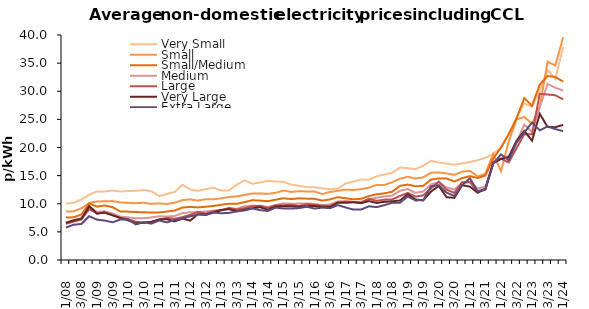
| Category | Very Small | Small | Small/Medium | Medium | Large | Very Large | Extra Large |
|---|---|---|---|---|---|---|---|
| Q1/08  | 10.021 | 8.605 | 7.549 | 6.615 | 6.438 | 6.609 | 5.766 |
| Q2/08  | 10.173 | 8.651 | 7.588 | 7.026 | 6.809 | 7.068 | 6.275 |
| Q3/08  | 10.758 | 9.199 | 8.096 | 7.475 | 7.214 | 7.329 | 6.405 |
| Q4/08  | 11.603 | 10.126 | 10.065 | 9.495 | 9.032 | 9.582 | 7.785 |
| Q1/09  | 12.185 | 10.413 | 9.486 | 8.537 | 8.293 | 8.235 | 7.18 |
| Q2/09  | 12.177 | 10.43 | 9.697 | 8.672 | 8.45 | 8.422 | 7.002 |
| Q3/09  | 12.352 | 10.476 | 9.395 | 8.271 | 7.943 | 7.973 | 6.712 |
| Q4/09  | 12.183 | 10.22 | 8.617 | 7.713 | 7.479 | 7.469 | 7.181 |
| Q1/10  | 12.259 | 10.171 | 8.6 | 7.597 | 7.258 | 7.055 | 7.245 |
| Q2/10  | 12.301 | 10.091 | 8.524 | 7.412 | 6.803 | 6.511 | 6.333 |
| Q3/10  | 12.424 | 10.175 | 8.478 | 7.433 | 6.676 | 6.615 | 6.713 |
| Q4/10  | 12.228 | 9.99 | 8.435 | 7.576 | 6.761 | 6.768 | 6.461 |
| Q1/11  | 11.359 | 10.055 | 8.458 | 7.77 | 7.15 | 7.222 | 7.024 |
| Q2/11  | 11.741 | 9.97 | 8.612 | 7.737 | 7.481 | 7.25 | 6.695 |
| Q3/11  | 12.114 | 10.168 | 8.792 | 7.809 | 7.323 | 6.863 | 7.114 |
| Q4/11  | 13.371 | 10.64 | 9.32 | 8.335 | 7.624 | 7.357 | 7.388 |
| Q1/12  | 12.541 | 10.784 | 9.448 | 8.462 | 8.023 | 7.001 | 7.761 |
| Q2/12  | 12.29 | 10.551 | 9.341 | 8.527 | 8.55 | 8.156 | 8.083 |
| Q3/12  | 12.617 | 10.804 | 9.476 | 8.621 | 8.259 | 8.079 | 7.993 |
| Q4/12  | 12.852 | 10.803 | 9.604 | 8.777 | 8.665 | 8.446 | 8.426 |
| Q1/13  | 12.346 | 10.954 | 9.824 | 8.93 | 8.801 | 8.894 | 8.311 |
| Q2/13  | 12.379 | 11.208 | 10.012 | 9.131 | 9.266 | 9.038 | 8.378 |
| Q3/13  | 13.403 | 11.3 | 9.987 | 9.104 | 8.985 | 8.672 | 8.634 |
| Q4/13  | 14.157 | 11.562 | 10.287 | 9.551 | 9.209 | 8.942 | 8.808 |
| Q1/14  | 13.554 | 11.839 | 10.625 | 9.705 | 9.553 | 9.203 | 9.159 |
| Q2/14  | 13.778 | 11.83 | 10.554 | 9.555 | 9.648 | 9.391 | 8.867 |
| Q3/14  | 14.077 | 11.763 | 10.457 | 9.414 | 9.294 | 8.935 | 8.718 |
| Q4/14  | 13.961 | 11.941 | 10.722 | 9.789 | 9.689 | 9.549 | 9.31 |
| Q1/15  | 13.901 | 12.35 | 10.978 | 10.076 | 9.732 | 9.555 | 9.157 |
| Q2/15  | 13.407 | 12.102 | 10.823 | 9.995 | 9.842 | 9.545 | 9.133 |
| Q3/15  | 13.189 | 12.237 | 10.965 | 10.041 | 9.601 | 9.475 | 9.23 |
| Q4/15  | 12.963 | 12.177 | 10.909 | 10.049 | 9.951 | 9.573 | 9.463 |
| Q1/16  | 12.937 | 12.183 | 10.871 | 10.005 | 9.792 | 9.593 | 9.151 |
| Q2/16  | 12.755 | 11.714 | 10.565 | 9.718 | 9.672 | 9.445 | 9.314 |
| Q3/16  | 12.584 | 12.095 | 10.768 | 9.884 | 9.603 | 9.408 | 9.214 |
| Q4/16  | 12.689 | 12.297 | 11.173 | 10.412 | 10.261 | 10.164 | 9.759 |
| Q1/17  | 13.604 | 12.502 | 10.976 | 10.462 | 10.352 | 10.17 | 9.35 |
| Q2/17  | 13.928 | 12.436 | 10.784 | 10.311 | 10.329 | 10.257 | 8.957 |
| Q3/17  | 14.302 | 12.593 | 10.875 | 10.368 | 10.2 | 10.098 | 8.97 |
| Q4/17  | 14.274 | 12.863 | 11.363 | 10.796 | 10.876 | 10.469 | 9.548 |
| Q1/18  | 14.872 | 13.357 | 11.695 | 11.084 | 10.524 | 10.14 | 9.405 |
| Q2/18  | 15.2 | 13.328 | 11.845 | 11.286 | 10.728 | 10.34 | 9.745 |
| Q3/18  | 15.515 | 13.841 | 12.134 | 11.445 | 10.777 | 10.432 | 10.177 |
| Q4/18  | 16.445 | 14.444 | 13.176 | 12.306 | 11.383 | 10.584 | 10.186 |
| Q1/19  | 16.327 | 14.798 | 13.418 | 12.61 | 11.926 | 11.703 | 11.298 |
| Q2/19  | 16.156 | 14.485 | 13.096 | 11.947 | 11.27 | 10.755 | 10.596 |
| Q3/19  | 16.767 | 14.698 | 13.18 | 12.195 | 11.494 | 10.611 | 10.612 |
| Q4/19  | 17.648 | 15.512 | 14.302 | 13.453 | 12.727 | 12.175 | 13.106 |
| Q1/20  | 17.342 | 15.58 | 14.509 | 13.795 | 13.947 | 13.159 | 13.303 |
| Q2/20  | 17.143 | 15.385 | 14.506 | 12.886 | 12.506 | 11.166 | 11.975 |
| Q3/20  | 16.937 | 15.146 | 13.951 | 12.528 | 11.93 | 11.042 | 11.383 |
| Q4/20  | 17.172 | 15.7 | 14.562 | 13.712 | 13.813 | 13.294 | 13.307 |
| Q1/21  | 17.414 | 15.845 | 14.909 | 13.843 | 13.857 | 13.048 | 14.529 |
| Q2/21  | 17.743 | 14.854 | 14.574 | 12.717 | 12.085 | 11.967 | 12.227 |
| Q3/21  | 18.176 | 15.331 | 15.017 | 13.043 | 12.501 | 12.64 | 12.653 |
| Q4/21  | 18.843 | 18.893 | 18.042 | 17.219 | 17.439 | 17.219 | 17.074 |
| Q1/22  | 20.055 | 15.797 | 19.95 | 18.089 | 18.012 | 17.947 | 18.784 |
| Q2/22  | 22.424 | 21.049 | 22.342 | 18.466 | 17.347 | 18.284 | 17.739 |
| Q3/22  | 25.268 | 24.988 | 25.151 | 20.939 | 19.863 | 21.174 | 20.847 |
| Q4/22  | 27.872 | 25.426 | 28.788 | 24.071 | 22.35 | 22.951 | 22.689 |
| Q1/23  | 27.246 | 24.221 | 27.431 | 22.812 | 22.345 | 21.212 | 24.439 |
| Q2/23  | 30.034 | 27.293 | 31.193 | 27.2 | 29.537 | 25.989 | 23.043 |
| Q3/23  | 33.822 | 35.237 | 32.707 | 31.317 | 29.427 | 23.635 | 23.738 |
| Q4/23  | 32.207 | 34.572 | 32.539 | 30.623 | 29.288 | 23.616 | 23.274 |
| Q1/24  | 37.867 | 39.575 | 31.718 | 30.121 | 28.555 | 24.017 | 22.904 |